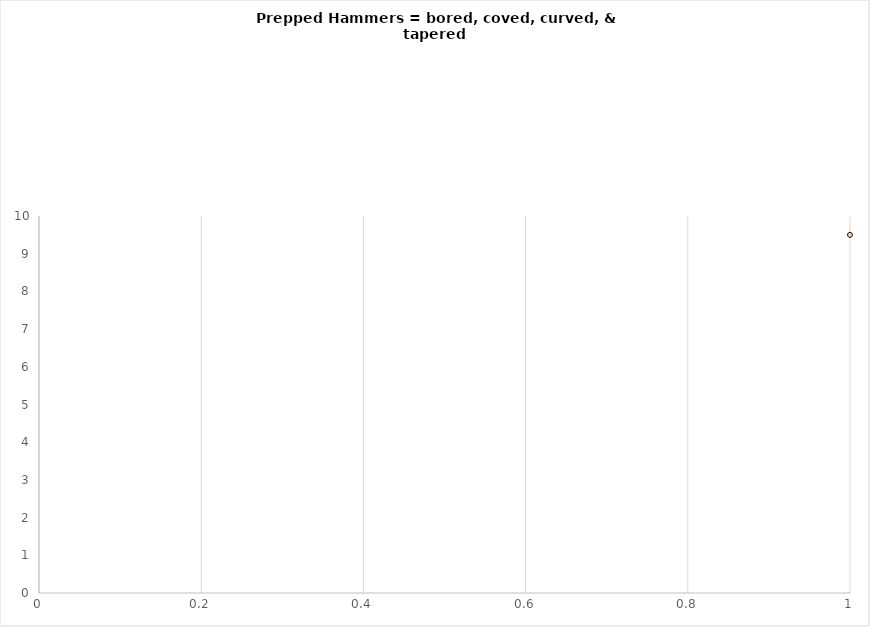
| Category | Series 0 |
|---|---|
| 0 | 9.5 |
| 1 | 9.47 |
| 2 | 9.44 |
| 3 | 9.4 |
| 4 | 9.37 |
| 5 | 9.34 |
| 6 | 9.31 |
| 7 | 9.27 |
| 8 | 9.24 |
| 9 | 9.2 |
| 10 | 9.17 |
| 11 | 9.14 |
| 12 | 9.1 |
| 13 | 9.06 |
| 14 | 9.03 |
| 15 | 9 |
| 16 | 8.9 |
| 17 | 8.9 |
| 18 | 8.9 |
| 19 | 8.9 |
| 20 | 8.8 |
| 21 | 8.7 |
| 22 | 8.7 |
| 23 | 8.7 |
| 24 | 8.6 |
| 25 | 8.55 |
| 26 | 8.5 |
| 27 | 8.44 |
| 28 | 8.39 |
| 29 | 8.33 |
| 30 | 8.27 |
| 31 | 8.21 |
| 32 | 8.15 |
| 33 | 8.09 |
| 34 | 8.03 |
| 35 | 7.96 |
| 36 | 7.9 |
| 37 | 7.84 |
| 38 | 7.77 |
| 39 | 7.71 |
| 40 | 7.64 |
| 41 | 7.57 |
| 42 | 7.51 |
| 43 | 7.44 |
| 44 | 7.37 |
| 45 | 7.3 |
| 46 | 7.24 |
| 47 | 7.17 |
| 48 | 7.1 |
| 49 | 7.03 |
| 50 | 6.96 |
| 51 | 6.89 |
| 52 | 6.82 |
| 53 | 6.75 |
| 54 | 6.68 |
| 55 | 6.6 |
| 56 | 6.53 |
| 57 | 6.45 |
| 58 | 6.37 |
| 59 | 6.29 |
| 60 | 6.2 |
| 61 | 6.11 |
| 62 | 6.02 |
| 63 | 5.92 |
| 64 | 5.83 |
| 65 | 5.73 |
| 66 | 5.63 |
| 67 | 5.53 |
| 68 | 5.42 |
| 69 | 5.32 |
| 70 | 5.21 |
| 71 | 5.11 |
| 72 | 5 |
| 73 | 4.89 |
| 74 | 4.79 |
| 75 | 4.68 |
| 76 | 4.6 |
| 77 | 4.5 |
| 78 | 4.4 |
| 79 | 4.4 |
| 80 | 4.2 |
| 81 | 4 |
| 82 | 3.9 |
| 83 | 4.1 |
| 84 | 3.9 |
| 85 | 3.7 |
| 86 | 3.8 |
| 87 | 3.8 |